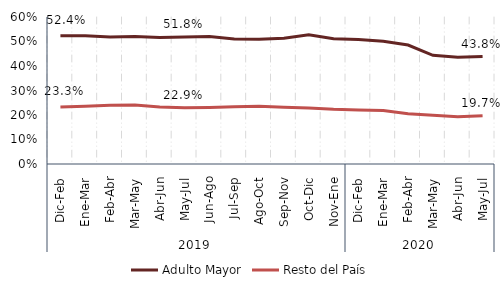
| Category | Adulto Mayor | Resto del País |
|---|---|---|
| 0 | 0.524 | 0.233 |
| 1 | 0.523 | 0.235 |
| 2 | 0.518 | 0.24 |
| 3 | 0.521 | 0.241 |
| 4 | 0.516 | 0.233 |
| 5 | 0.518 | 0.229 |
| 6 | 0.521 | 0.231 |
| 7 | 0.51 | 0.233 |
| 8 | 0.509 | 0.236 |
| 9 | 0.513 | 0.231 |
| 10 | 0.528 | 0.228 |
| 11 | 0.512 | 0.223 |
| 12 | 0.508 | 0.221 |
| 13 | 0.501 | 0.219 |
| 14 | 0.486 | 0.205 |
| 15 | 0.444 | 0.199 |
| 16 | 0.435 | 0.192 |
| 17 | 0.438 | 0.197 |